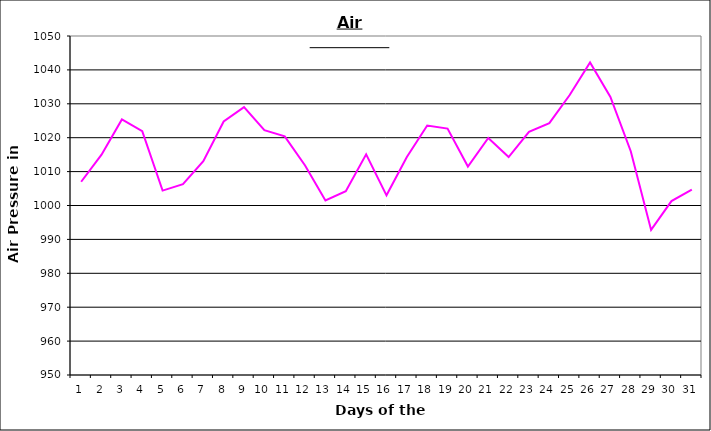
| Category | Series 0 |
|---|---|
| 0 | 1007 |
| 1 | 1015 |
| 2 | 1025.4 |
| 3 | 1021.9 |
| 4 | 1004.4 |
| 5 | 1006.3 |
| 6 | 1013.1 |
| 7 | 1024.8 |
| 8 | 1029 |
| 9 | 1022.2 |
| 10 | 1020.4 |
| 11 | 1011.8 |
| 12 | 1001.5 |
| 13 | 1004.2 |
| 14 | 1015.1 |
| 15 | 1003 |
| 16 | 1014.3 |
| 17 | 1023.6 |
| 18 | 1022.7 |
| 19 | 1011.5 |
| 20 | 1019.9 |
| 21 | 1014.3 |
| 22 | 1021.7 |
| 23 | 1024.3 |
| 24 | 1032.6 |
| 25 | 1042.2 |
| 26 | 1032 |
| 27 | 1016 |
| 28 | 992.8 |
| 29 | 1001.3 |
| 30 | 1004.7 |